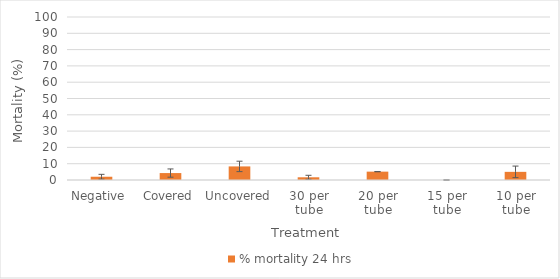
| Category | % mortality 24 hrs |
|---|---|
| Negative  | 2 |
| Covered | 4.255 |
| Uncovered | 8.333 |
| 30 per tube | 1.667 |
| 20 per tube | 5.128 |
| 15 per tube | 0 |
| 10 per tube | 5 |